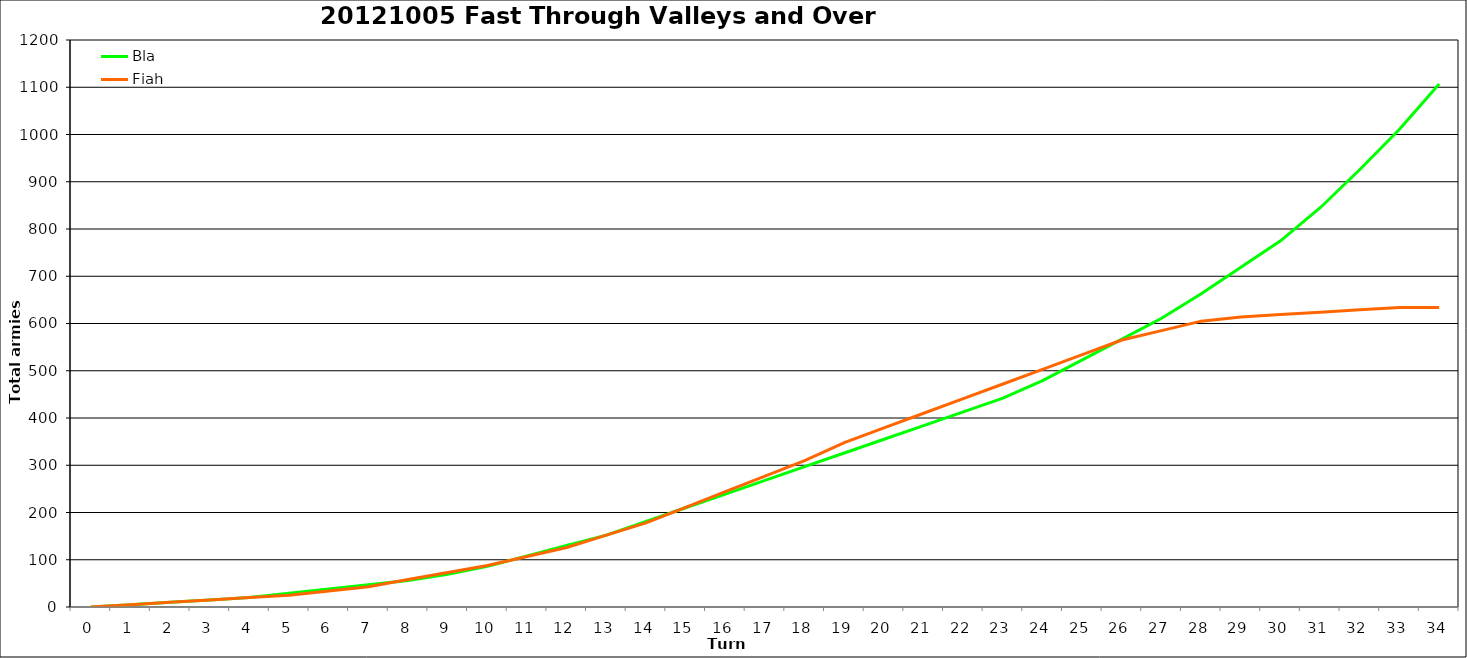
| Category | Bla | Fiah |
|---|---|---|
| 0.0 | 0 | 0 |
| 1.0 | 5 | 5 |
| 2.0 | 10 | 10 |
| 3.0 | 15 | 15 |
| 4.0 | 20 | 20 |
| 5.0 | 29 | 25 |
| 6.0 | 38 | 34 |
| 7.0 | 47 | 43 |
| 8.0 | 56 | 58 |
| 9.0 | 69 | 73 |
| 10.0 | 86 | 88 |
| 11.0 | 108 | 107 |
| 12.0 | 130 | 126 |
| 13.0 | 152 | 152 |
| 14.0 | 181 | 178 |
| 15.0 | 210 | 211 |
| 16.0 | 239 | 244 |
| 17.0 | 268 | 277 |
| 18.0 | 297 | 310 |
| 19.0 | 326 | 348 |
| 20.0 | 355 | 379 |
| 21.0 | 384 | 410 |
| 22.0 | 413 | 441 |
| 23.0 | 442 | 472 |
| 24.0 | 479 | 503 |
| 25.0 | 523 | 534 |
| 26.0 | 567 | 565 |
| 27.0 | 611 | 585 |
| 28.0 | 663 | 605 |
| 29.0 | 719 | 614 |
| 30.0 | 775 | 619 |
| 31.0 | 845 | 624 |
| 32.0 | 926 | 629 |
| 33.0 | 1011 | 634 |
| 34.0 | 1107 | 634 |